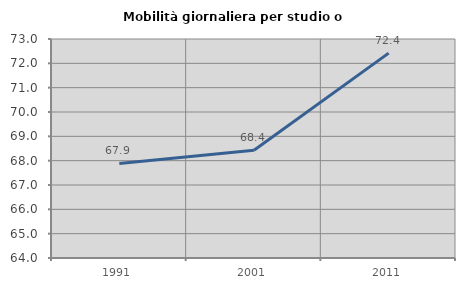
| Category | Mobilità giornaliera per studio o lavoro |
|---|---|
| 1991.0 | 67.887 |
| 2001.0 | 68.429 |
| 2011.0 | 72.42 |